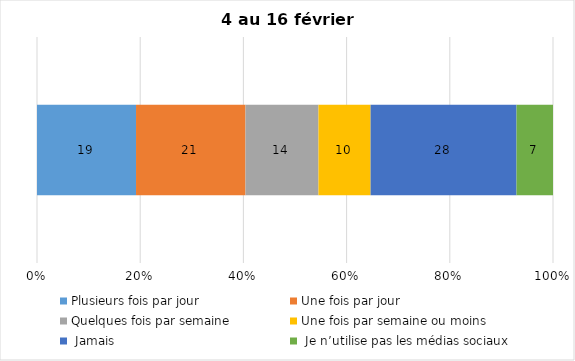
| Category | Plusieurs fois par jour | Une fois par jour | Quelques fois par semaine   | Une fois par semaine ou moins   |  Jamais   |  Je n’utilise pas les médias sociaux |
|---|---|---|---|---|---|---|
| 0 | 19 | 21 | 14 | 10 | 28 | 7 |